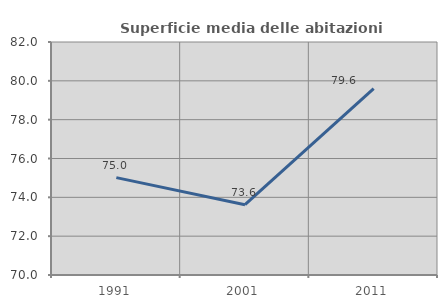
| Category | Superficie media delle abitazioni occupate |
|---|---|
| 1991.0 | 75.016 |
| 2001.0 | 73.619 |
| 2011.0 | 79.603 |